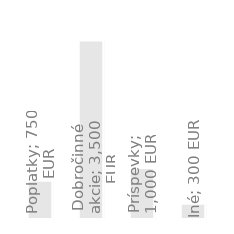
| Category | Ročné výnosy |
|---|---|
| Poplatky | 750 |
| Dobročinné akcie | 3500 |
| Príspevky | 1000 |
| Iné | 300 |